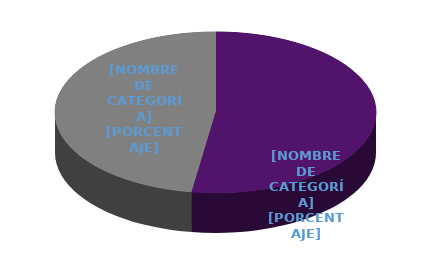
| Category | Series 0 |
|---|---|
| FEMENINO | 11 |
| MASCULINO | 10 |